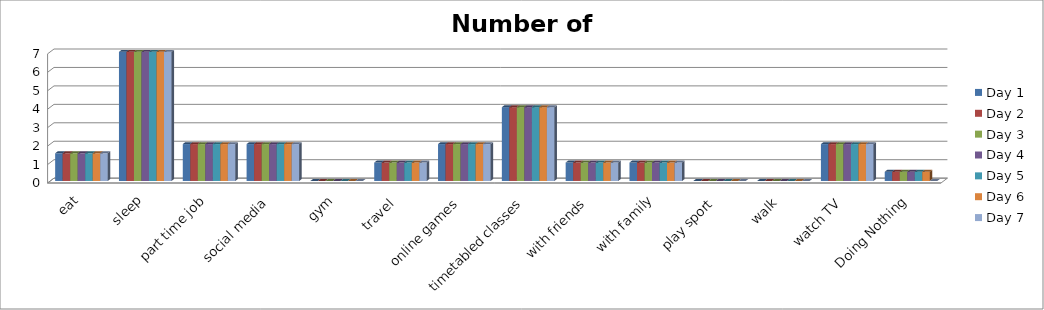
| Category | Day 1 | Day 2 | Day 3 | Day 4 | Day 5 | Day 6 | Day 7 |
|---|---|---|---|---|---|---|---|
| eat | 1.5 | 1.5 | 1.5 | 1.5 | 1.5 | 1.5 | 1.5 |
| sleep | 7 | 7 | 7 | 7 | 7 | 7 | 7 |
| part time job | 2 | 2 | 2 | 2 | 2 | 2 | 2 |
| social media | 2 | 2 | 2 | 2 | 2 | 2 | 2 |
| gym | 0 | 0 | 0 | 0 | 0 | 0 | 0 |
| travel | 1 | 1 | 1 | 1 | 1 | 1 | 1 |
| online games | 2 | 2 | 2 | 2 | 2 | 2 | 2 |
| timetabled classes | 4 | 4 | 4 | 4 | 4 | 4 | 4 |
| with friends | 1 | 1 | 1 | 1 | 1 | 1 | 1 |
| with family | 1 | 1 | 1 | 1 | 1 | 1 | 1 |
| play sport | 0 | 0 | 0 | 0 | 0 | 0 | 0 |
| walk | 0 | 0 | 0 | 0 | 0 | 0 | 0 |
| watch TV | 2 | 2 | 2 | 2 | 2 | 2 | 2 |
| Doing Nothing | 0.5 | 0.5 | 0.5 | 0.5 | 0.5 | 0.5 | 0 |